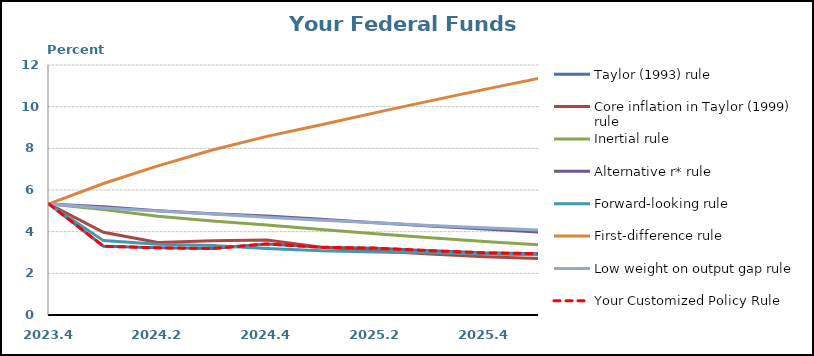
| Category | Taylor (1993) rule | Core inflation in Taylor (1999) rule | Inertial rule | Alternative r* rule | Forward-looking rule | First-difference rule | Low weight on output gap rule | Your Customized Policy Rule |
|---|---|---|---|---|---|---|---|---|
| 2023.4 | 5.33 | 5.33 | 5.33 | 5.33 | 5.33 | 5.33 | 5.33 | 5.33 |
| 2024.1 | 3.301 | 3.969 | 5.058 | 5.201 | 3.57 | 6.311 | 5.138 | 3.301 |
| 2024.2 | 3.224 | 3.481 | 4.742 | 5.001 | 3.396 | 7.156 | 4.993 | 3.224 |
| 2024.3 | 3.191 | 3.565 | 4.507 | 4.857 | 3.338 | 7.918 | 4.849 | 3.191 |
| 2024.4 | 3.412 | 3.596 | 4.325 | 4.748 | 3.191 | 8.575 | 4.695 | 3.412 |
| 2025.1 | 3.253 | 3.248 | 4.109 | 4.592 | 3.081 | 9.128 | 4.553 | 3.253 |
| 2025.2 | 3.209 | 3.073 | 3.902 | 4.431 | 3.029 | 9.713 | 4.423 | 3.209 |
| 2025.3 | 3.09 | 2.931 | 3.708 | 4.275 | 2.983 | 10.278 | 4.298 | 3.09 |
| 2025.4 | 2.983 | 2.801 | 3.527 | 4.124 | 2.932 | 10.83 | 4.185 | 2.983 |
| 2026.1 | 2.944 | 2.713 | 3.364 | 3.985 | 2.896 | 11.366 | 4.08 | 2.944 |